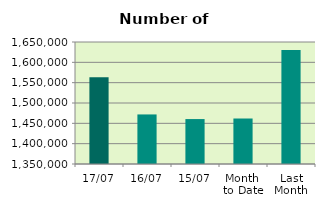
| Category | Series 0 |
|---|---|
| 17/07 | 1563610 |
| 16/07 | 1471872 |
| 15/07 | 1460508 |
| Month 
to Date | 1461863.231 |
| Last
Month | 1630183.4 |